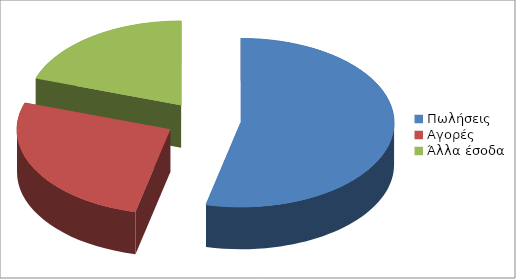
| Category | Series 0 |
|---|---|
| Πωλήσεις  | 8100 |
| Αγορές | 4000 |
| Άλλα έσοδα | 3000 |